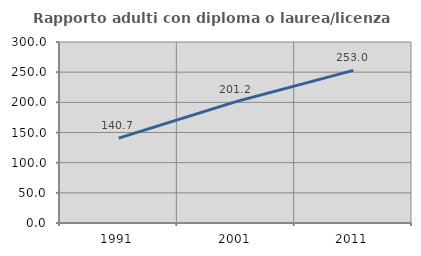
| Category | Rapporto adulti con diploma o laurea/licenza media  |
|---|---|
| 1991.0 | 140.682 |
| 2001.0 | 201.156 |
| 2011.0 | 253.028 |